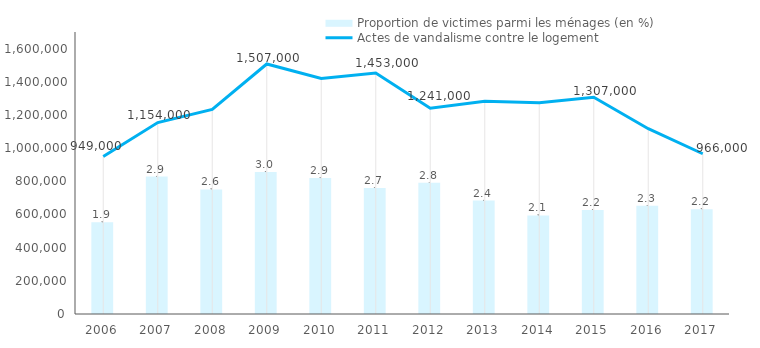
| Category | Proportion de victimes parmi les ménages (en %) |
|---|---|
| 2006.0 | 1.95 |
| 2007.0 | 2.923 |
| 2008.0 | 2.65 |
| 2009.0 | 3.02 |
| 2010.0 | 2.892 |
| 2011.0 | 2.683 |
| 2012.0 | 2.795 |
| 2013.0 | 2.414 |
| 2014.0 | 2.096 |
| 2015.0 | 2.215 |
| 2016.0 | 2.303 |
| 2017.0 | 2.228 |